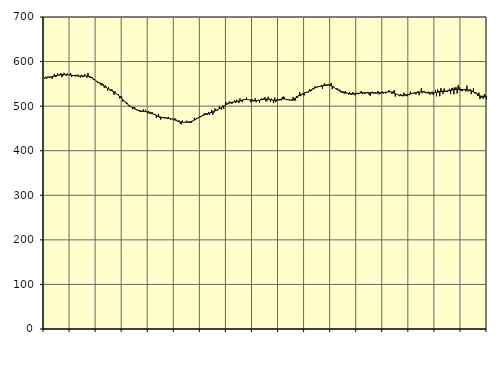
| Category | Piggar | Series 1 |
|---|---|---|
| nan | 561.6 | 563.35 |
| 87.0 | 565.9 | 563.43 |
| 87.0 | 561.8 | 563.88 |
| 87.0 | 566.3 | 564.28 |
| 87.0 | 566 | 564.69 |
| 87.0 | 563.5 | 565.1 |
| 87.0 | 566.6 | 565.58 |
| 87.0 | 561.2 | 566.17 |
| 87.0 | 568.1 | 566.76 |
| 87.0 | 571.8 | 567.4 |
| 87.0 | 565.2 | 568.05 |
| 87.0 | 565.8 | 568.67 |
| nan | 573.2 | 569.22 |
| 88.0 | 568.7 | 569.68 |
| 88.0 | 571.3 | 570.05 |
| 88.0 | 573.9 | 570.33 |
| 88.0 | 565.1 | 570.54 |
| 88.0 | 568.6 | 570.68 |
| 88.0 | 574.6 | 570.76 |
| 88.0 | 570.8 | 570.78 |
| 88.0 | 567.5 | 570.7 |
| 88.0 | 573.3 | 570.53 |
| 88.0 | 570 | 570.3 |
| 88.0 | 570.3 | 570.03 |
| nan | 573.6 | 569.73 |
| 89.0 | 565.5 | 569.4 |
| 89.0 | 568.3 | 569.04 |
| 89.0 | 568.1 | 568.67 |
| 89.0 | 566.9 | 568.35 |
| 89.0 | 570.3 | 568.07 |
| 89.0 | 567.6 | 567.84 |
| 89.0 | 570.7 | 567.67 |
| 89.0 | 566.8 | 567.61 |
| 89.0 | 564.1 | 567.62 |
| 89.0 | 570.3 | 567.69 |
| 89.0 | 565 | 567.81 |
| nan | 565.6 | 567.91 |
| 90.0 | 571.8 | 567.98 |
| 90.0 | 568 | 567.96 |
| 90.0 | 563.8 | 567.78 |
| 90.0 | 574.6 | 567.36 |
| 90.0 | 565.8 | 566.67 |
| 90.0 | 563.2 | 565.66 |
| 90.0 | 565.8 | 564.34 |
| 90.0 | 564.3 | 562.81 |
| 90.0 | 559 | 561.13 |
| 90.0 | 560 | 559.38 |
| 90.0 | 558.1 | 557.65 |
| nan | 555.3 | 555.97 |
| 91.0 | 552.5 | 554.36 |
| 91.0 | 553 | 552.79 |
| 91.0 | 552.7 | 551.27 |
| 91.0 | 546.5 | 549.73 |
| 91.0 | 551.1 | 548.17 |
| 91.0 | 549 | 546.59 |
| 91.0 | 541.2 | 545 |
| 91.0 | 546.2 | 543.39 |
| 91.0 | 543.7 | 541.8 |
| 91.0 | 534 | 540.27 |
| 91.0 | 542 | 538.8 |
| nan | 535.6 | 537.37 |
| 92.0 | 534.5 | 536.01 |
| 92.0 | 537.9 | 534.67 |
| 92.0 | 532.5 | 533.3 |
| 92.0 | 525.3 | 531.85 |
| 92.0 | 533 | 530.26 |
| 92.0 | 527.4 | 528.48 |
| 92.0 | 526.5 | 526.54 |
| 92.0 | 527 | 524.44 |
| 92.0 | 517.6 | 522.18 |
| 92.0 | 521.9 | 519.83 |
| 92.0 | 521.4 | 517.43 |
| nan | 510.1 | 514.95 |
| 93.0 | 512.8 | 512.46 |
| 93.0 | 511.1 | 510.01 |
| 93.0 | 506.5 | 507.63 |
| 93.0 | 507.9 | 505.41 |
| 93.0 | 503.2 | 503.36 |
| 93.0 | 499 | 501.5 |
| 93.0 | 499.7 | 499.82 |
| 93.0 | 498.7 | 498.26 |
| 93.0 | 493 | 496.81 |
| 93.0 | 497.7 | 495.43 |
| 93.0 | 498.1 | 494.12 |
| nan | 492.1 | 492.92 |
| 94.0 | 492.9 | 491.86 |
| 94.0 | 490.1 | 490.95 |
| 94.0 | 489.3 | 490.19 |
| 94.0 | 487.1 | 489.57 |
| 94.0 | 487.3 | 489.07 |
| 94.0 | 487.6 | 488.68 |
| 94.0 | 492.8 | 488.36 |
| 94.0 | 486.7 | 488.09 |
| 94.0 | 491.9 | 487.82 |
| 94.0 | 486.9 | 487.45 |
| 94.0 | 483.4 | 486.92 |
| nan | 489.1 | 486.25 |
| 95.0 | 482.9 | 485.44 |
| 95.0 | 483 | 484.51 |
| 95.0 | 487 | 483.48 |
| 95.0 | 482.1 | 482.39 |
| 95.0 | 482.4 | 481.26 |
| 95.0 | 482.3 | 480.13 |
| 95.0 | 473.9 | 478.99 |
| 95.0 | 477 | 477.88 |
| 95.0 | 482.8 | 476.88 |
| 95.0 | 474 | 476.01 |
| 95.0 | 469.8 | 475.31 |
| nan | 473.5 | 474.77 |
| 96.0 | 475.6 | 474.36 |
| 96.0 | 472.8 | 474.02 |
| 96.0 | 475.3 | 473.72 |
| 96.0 | 473.5 | 473.42 |
| 96.0 | 471.3 | 473.1 |
| 96.0 | 475.9 | 472.77 |
| 96.0 | 472.5 | 472.43 |
| 96.0 | 468.8 | 472.03 |
| 96.0 | 472.1 | 471.51 |
| 96.0 | 471.1 | 470.84 |
| 96.0 | 468.3 | 470.07 |
| nan | 472.8 | 469.19 |
| 97.0 | 470 | 468.2 |
| 97.0 | 467.7 | 467.2 |
| 97.0 | 464.4 | 466.26 |
| 97.0 | 467.7 | 465.44 |
| 97.0 | 460.9 | 464.8 |
| 97.0 | 459.3 | 464.33 |
| 97.0 | 467.9 | 463.99 |
| 97.0 | 463.7 | 463.79 |
| 97.0 | 464 | 463.71 |
| 97.0 | 464.6 | 463.73 |
| 97.0 | 467.3 | 463.85 |
| nan | 464.9 | 464.06 |
| 98.0 | 462.9 | 464.38 |
| 98.0 | 463 | 464.85 |
| 98.0 | 462.3 | 465.51 |
| 98.0 | 465.5 | 466.37 |
| 98.0 | 467.1 | 467.43 |
| 98.0 | 473.6 | 468.69 |
| 98.0 | 468.8 | 470.11 |
| 98.0 | 473.7 | 471.59 |
| 98.0 | 472.4 | 473.1 |
| 98.0 | 474 | 474.57 |
| 98.0 | 477.2 | 475.92 |
| nan | 474.9 | 477.17 |
| 99.0 | 478.8 | 478.34 |
| 99.0 | 478.5 | 479.44 |
| 99.0 | 483.1 | 480.47 |
| 99.0 | 484.1 | 481.41 |
| 99.0 | 480.1 | 482.27 |
| 99.0 | 480.8 | 483.03 |
| 99.0 | 487 | 483.73 |
| 99.0 | 480.2 | 484.46 |
| 99.0 | 486.8 | 485.25 |
| 99.0 | 491.8 | 486.15 |
| 99.0 | 480.5 | 487.16 |
| nan | 485.5 | 488.24 |
| 0.0 | 494.8 | 489.36 |
| 0.0 | 489 | 490.51 |
| 0.0 | 490.6 | 491.68 |
| 0.0 | 493 | 492.87 |
| 0.0 | 499.4 | 494.15 |
| 0.0 | 494.5 | 495.54 |
| 0.0 | 492.4 | 497.05 |
| 0.0 | 501.4 | 498.62 |
| 0.0 | 493.8 | 500.22 |
| 0.0 | 501.6 | 501.77 |
| 0.0 | 509.4 | 503.24 |
| nan | 504.6 | 504.63 |
| 1.0 | 504.5 | 505.85 |
| 1.0 | 510.4 | 506.86 |
| 1.0 | 508.9 | 507.69 |
| 1.0 | 505.4 | 508.34 |
| 1.0 | 506.2 | 508.83 |
| 1.0 | 508.9 | 509.19 |
| 1.0 | 512.5 | 509.52 |
| 1.0 | 507.1 | 509.86 |
| 1.0 | 514.5 | 510.27 |
| 1.0 | 509.9 | 510.79 |
| 1.0 | 506.8 | 511.4 |
| nan | 517.3 | 512.07 |
| 2.0 | 511.1 | 512.79 |
| 2.0 | 509 | 513.48 |
| 2.0 | 514.7 | 514.06 |
| 2.0 | 515.2 | 514.51 |
| 2.0 | 516 | 514.81 |
| 2.0 | 519.4 | 514.92 |
| 2.0 | 514.6 | 514.83 |
| 2.0 | 514.9 | 514.54 |
| 2.0 | 513.9 | 514.09 |
| 2.0 | 508.4 | 513.54 |
| 2.0 | 515.7 | 512.98 |
| nan | 510.9 | 512.47 |
| 3.0 | 510.9 | 512.11 |
| 3.0 | 517.8 | 512.02 |
| 3.0 | 508.7 | 512.16 |
| 3.0 | 511.9 | 512.46 |
| 3.0 | 514.1 | 512.92 |
| 3.0 | 507.8 | 513.44 |
| 3.0 | 516 | 513.97 |
| 3.0 | 517.1 | 514.53 |
| 3.0 | 513.8 | 515.04 |
| 3.0 | 517.6 | 515.47 |
| 3.0 | 520.1 | 515.76 |
| nan | 510.2 | 515.85 |
| 4.0 | 512.6 | 515.76 |
| 4.0 | 521.1 | 515.49 |
| 4.0 | 516.5 | 515.09 |
| 4.0 | 509.8 | 514.63 |
| 4.0 | 517 | 514.13 |
| 4.0 | 512.9 | 513.68 |
| 4.0 | 506.8 | 513.38 |
| 4.0 | 519.4 | 513.24 |
| 4.0 | 509 | 513.31 |
| 4.0 | 515.4 | 513.59 |
| 4.0 | 513.4 | 514.03 |
| nan | 513 | 514.59 |
| 5.0 | 514.9 | 515.19 |
| 5.0 | 512.6 | 515.67 |
| 5.0 | 520.5 | 515.96 |
| 5.0 | 521.5 | 516.06 |
| 5.0 | 519.6 | 515.94 |
| 5.0 | 515.6 | 515.61 |
| 5.0 | 513.5 | 515.15 |
| 5.0 | 514.1 | 514.61 |
| 5.0 | 514.8 | 514.11 |
| 5.0 | 513 | 513.81 |
| 5.0 | 513.5 | 513.82 |
| nan | 512.3 | 514.25 |
| 6.0 | 520.5 | 515.1 |
| 6.0 | 511.5 | 516.3 |
| 6.0 | 513.2 | 517.76 |
| 6.0 | 522.8 | 519.35 |
| 6.0 | 518.2 | 520.97 |
| 6.0 | 524.6 | 522.59 |
| 6.0 | 531.8 | 524.12 |
| 6.0 | 522.4 | 525.53 |
| 6.0 | 526.4 | 526.79 |
| 6.0 | 529.2 | 527.89 |
| 6.0 | 523.9 | 528.88 |
| nan | 531.8 | 529.81 |
| 7.0 | 531.9 | 530.75 |
| 7.0 | 531.3 | 531.78 |
| 7.0 | 530.8 | 532.97 |
| 7.0 | 538.3 | 534.28 |
| 7.0 | 533.3 | 535.69 |
| 7.0 | 534.9 | 537.15 |
| 7.0 | 539.7 | 538.54 |
| 7.0 | 537.8 | 539.8 |
| 7.0 | 544.3 | 540.96 |
| 7.0 | 542.5 | 541.95 |
| 7.0 | 542.8 | 542.79 |
| nan | 545 | 543.48 |
| 8.0 | 543.3 | 544 |
| 8.0 | 543.4 | 544.47 |
| 8.0 | 547.7 | 544.93 |
| 8.0 | 539.1 | 545.42 |
| 8.0 | 548.1 | 545.95 |
| 8.0 | 551.1 | 546.51 |
| 8.0 | 545.1 | 547 |
| 8.0 | 545.6 | 547.35 |
| 8.0 | 549.6 | 547.45 |
| 8.0 | 546.4 | 547.22 |
| 8.0 | 548.8 | 546.63 |
| nan | 551.8 | 545.68 |
| 9.0 | 538 | 544.42 |
| 9.0 | 544.4 | 542.89 |
| 9.0 | 542.1 | 541.2 |
| 9.0 | 539.9 | 539.45 |
| 9.0 | 539.4 | 537.79 |
| 9.0 | 539.9 | 536.24 |
| 9.0 | 534.9 | 534.86 |
| 9.0 | 537 | 533.7 |
| 9.0 | 531.1 | 532.73 |
| 9.0 | 529.7 | 531.9 |
| 9.0 | 532.9 | 531.18 |
| nan | 527.8 | 530.54 |
| 10.0 | 533.8 | 529.95 |
| 10.0 | 531.1 | 529.43 |
| 10.0 | 527.6 | 528.96 |
| 10.0 | 525.8 | 528.51 |
| 10.0 | 531.4 | 528.09 |
| 10.0 | 525.4 | 527.73 |
| 10.0 | 525.9 | 527.47 |
| 10.0 | 531.5 | 527.37 |
| 10.0 | 526.9 | 527.42 |
| 10.0 | 524.2 | 527.64 |
| 10.0 | 529.9 | 527.97 |
| nan | 528 | 528.37 |
| 11.0 | 526.6 | 528.8 |
| 11.0 | 528.5 | 529.18 |
| 11.0 | 532.4 | 529.48 |
| 11.0 | 533.8 | 529.71 |
| 11.0 | 527 | 529.84 |
| 11.0 | 530.8 | 529.9 |
| 11.0 | 527.7 | 529.92 |
| 11.0 | 529.2 | 529.89 |
| 11.0 | 531.9 | 529.84 |
| 11.0 | 530.6 | 529.83 |
| 11.0 | 525.6 | 529.84 |
| nan | 523.2 | 529.86 |
| 12.0 | 531.7 | 529.89 |
| 12.0 | 532.1 | 529.93 |
| 12.0 | 527.9 | 529.94 |
| 12.0 | 531.2 | 529.93 |
| 12.0 | 527.9 | 529.9 |
| 12.0 | 528.7 | 529.86 |
| 12.0 | 534.1 | 529.79 |
| 12.0 | 526.3 | 529.75 |
| 12.0 | 528.5 | 529.77 |
| 12.0 | 531.9 | 529.87 |
| 12.0 | 532.8 | 530.06 |
| nan | 528.3 | 530.36 |
| 13.0 | 530.4 | 530.75 |
| 13.0 | 528.3 | 531.17 |
| 13.0 | 531.1 | 531.58 |
| 13.0 | 531.2 | 531.93 |
| 13.0 | 535.2 | 532.11 |
| 13.0 | 534.9 | 532.07 |
| 13.0 | 532.1 | 531.77 |
| 13.0 | 527 | 531.16 |
| 13.0 | 532.9 | 530.29 |
| 13.0 | 535.7 | 529.24 |
| 13.0 | 521.5 | 528.1 |
| nan | 527.3 | 527 |
| 14.0 | 525.7 | 526.05 |
| 14.0 | 524.5 | 525.27 |
| 14.0 | 522.4 | 524.71 |
| 14.0 | 527.1 | 524.35 |
| 14.0 | 522.9 | 524.2 |
| 14.0 | 521.7 | 524.22 |
| 14.0 | 530.2 | 524.42 |
| 14.0 | 525.8 | 524.79 |
| 14.0 | 522.3 | 525.26 |
| 14.0 | 523 | 525.8 |
| 14.0 | 526.5 | 526.38 |
| nan | 524.7 | 526.97 |
| 15.0 | 532.7 | 527.52 |
| 15.0 | 528.6 | 528.03 |
| 15.0 | 527.6 | 528.5 |
| 15.0 | 530.3 | 528.96 |
| 15.0 | 530.5 | 529.4 |
| 15.0 | 526.3 | 529.86 |
| 15.0 | 529.5 | 530.29 |
| 15.0 | 534 | 530.7 |
| 15.0 | 524.5 | 531.1 |
| 15.0 | 531.2 | 531.46 |
| 15.0 | 540 | 531.74 |
| nan | 529 | 531.88 |
| 16.0 | 533.3 | 531.83 |
| 16.0 | 532.8 | 531.61 |
| 16.0 | 528.8 | 531.24 |
| 16.0 | 531.6 | 530.76 |
| 16.0 | 528.5 | 530.28 |
| 16.0 | 532.2 | 529.86 |
| 16.0 | 525.7 | 529.54 |
| 16.0 | 531 | 529.39 |
| 16.0 | 532.3 | 529.4 |
| 16.0 | 524.8 | 529.59 |
| 16.0 | 530.3 | 529.89 |
| nan | 535.6 | 530.28 |
| 17.0 | 522 | 530.76 |
| 17.0 | 537.7 | 531.25 |
| 17.0 | 533.9 | 531.76 |
| 17.0 | 522.3 | 532.24 |
| 17.0 | 540.4 | 532.63 |
| 17.0 | 534.8 | 532.98 |
| 17.0 | 527.4 | 533.27 |
| 17.0 | 539.5 | 533.5 |
| 17.0 | 531.9 | 533.71 |
| 17.0 | 533.1 | 533.91 |
| 17.0 | 531.4 | 534.11 |
| nan | 536 | 534.36 |
| 18.0 | 538.9 | 534.71 |
| 18.0 | 527 | 535.22 |
| 18.0 | 540 | 535.81 |
| 18.0 | 541.2 | 536.44 |
| 18.0 | 526.6 | 537.05 |
| 18.0 | 541.7 | 537.5 |
| 18.0 | 542.5 | 537.78 |
| 18.0 | 528.5 | 537.92 |
| 18.0 | 547.2 | 537.9 |
| 18.0 | 542.3 | 537.82 |
| 18.0 | 533.9 | 537.71 |
| nan | 534.4 | 537.54 |
| 19.0 | 533.9 | 537.34 |
| 19.0 | 537.3 | 537.12 |
| 19.0 | 538.6 | 536.91 |
| 19.0 | 533.1 | 536.67 |
| 19.0 | 546 | 536.41 |
| 19.0 | 532.8 | 536.14 |
| 19.0 | 535.2 | 535.76 |
| 19.0 | 538.5 | 535.23 |
| 19.0 | 526.9 | 534.51 |
| 19.0 | 531.8 | 533.48 |
| 19.0 | 539.9 | 532.19 |
| nan | 528.7 | 530.74 |
| 20.0 | 531.1 | 529.18 |
| 20.0 | 530 | 527.56 |
| 20.0 | 522.8 | 525.96 |
| 20.0 | 530.4 | 524.48 |
| 20.0 | 516 | 523.19 |
| 20.0 | 518.7 | 522.15 |
| 20.0 | 523.2 | 521.43 |
| 20.0 | 516.2 | 521.03 |
| 20.0 | 527 | 520.91 |
| 20.0 | 524.1 | 521.03 |
| 20.0 | 514.9 | 521.27 |